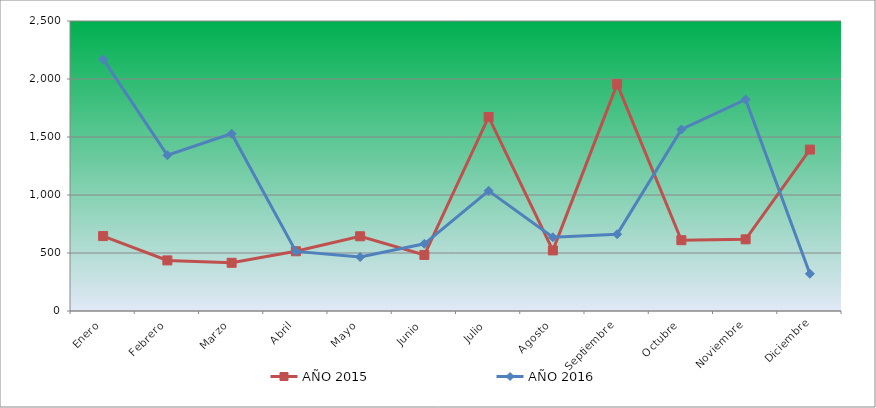
| Category | AÑO 2015 | AÑO 2016 |
|---|---|---|
| Enero | 645.905 | 2170.796 |
| Febrero | 436.22 | 1342.77 |
| Marzo | 415.626 | 1528.595 |
| Abril | 514.851 | 513.781 |
| Mayo | 644.032 | 465.028 |
| Junio | 483.024 | 579.41 |
| Julio | 1672.79 | 1036.263 |
| Agosto | 522.34 | 635.663 |
| Septiembre | 1955.878 | 661.915 |
| Octubre | 610.333 | 1564.685 |
| Noviembre | 617.822 | 1823.214 |
| Diciembre | 1391.502 | 320.644 |